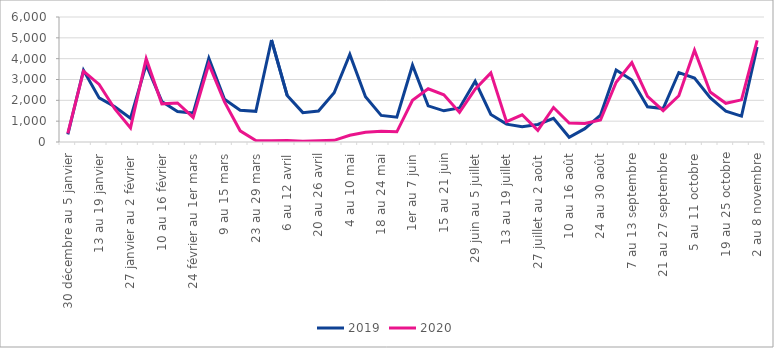
| Category | 2019 | 2020 |
|---|---|---|
| 30 décembre au 5 janvier | 369 | 411 |
| 6 au 12 janvier | 3446 | 3400 |
| 13 au 19 janvier | 2117 | 2765 |
| 20 au 26 janvier | 1689 | 1587 |
| 27 janvier au 2 février | 1140 | 677 |
| 3 au 9 février | 3711 | 4001 |
| 10 au 16 février | 1947 | 1832 |
| 17 au 23 février | 1464 | 1873 |
| 24 février au 1er mars | 1389 | 1178 |
| 2 au 8 mars | 4019 | 3741 |
| 9 au 15 mars | 2049 | 1927 |
| 16 au 22 mars | 1525 | 536 |
| 23 au 29 mars | 1473 | 74 |
| 30 mars au 5 avril | 4896 | 61 |
| 6 au 12 avril | 2237 | 69 |
| 13 au 19 avril | 1410 | 40 |
| 20 au 26 avril | 1489 | 59 |
| 27 avril au 3 mai | 2361 | 79 |
| 4 au 10 mai | 4200 | 324 |
| 11 au 17 mai | 2172 | 463 |
| 18 au 24 mai | 1275 | 517 |
| 25 au 31 mai | 1190 | 488 |
| 1er au 7 juin | 3685 | 2004 |
| 8 au 14 juin | 1736 | 2554 |
| 15 au 21 juin | 1497 | 2265 |
| 22 au 28 juin | 1634 | 1420 |
| 29 juin au 5 juillet | 2913 | 2532 |
| 6 au 12 juillet | 1321 | 3319 |
| 13 au 19 juillet | 858 | 974 |
| 20 au 26 juillet | 730 | 1307 |
| 27 juillet au 2 août | 843 | 556 |
| 3 au 9 août | 1137 | 1657 |
| 10 au 16 août | 229 | 910 |
| 17 au 23 août | 641 | 890 |
| 24 au 30 août | 1291 | 1057 |
| 31 août au 6 septembre | 3457 | 2867 |
| 7 au 13 septembre | 2973 | 3816 |
| 14 au 20 septembre | 1692 | 2188 |
| 21 au 27 septembre | 1603 | 1507 |
| 28 septembre au 4 octobre | 3335 | 2219 |
| 5 au 11 octobre | 3066 | 4403 |
| 12 au 18 octobre | 2128 | 2401 |
| 19 au 25 octobre | 1479 | 1859 |
| 26 octobre au 1er novembre | 1245 | 2023 |
| 2 au 8 novembre | 4560 | 4877 |